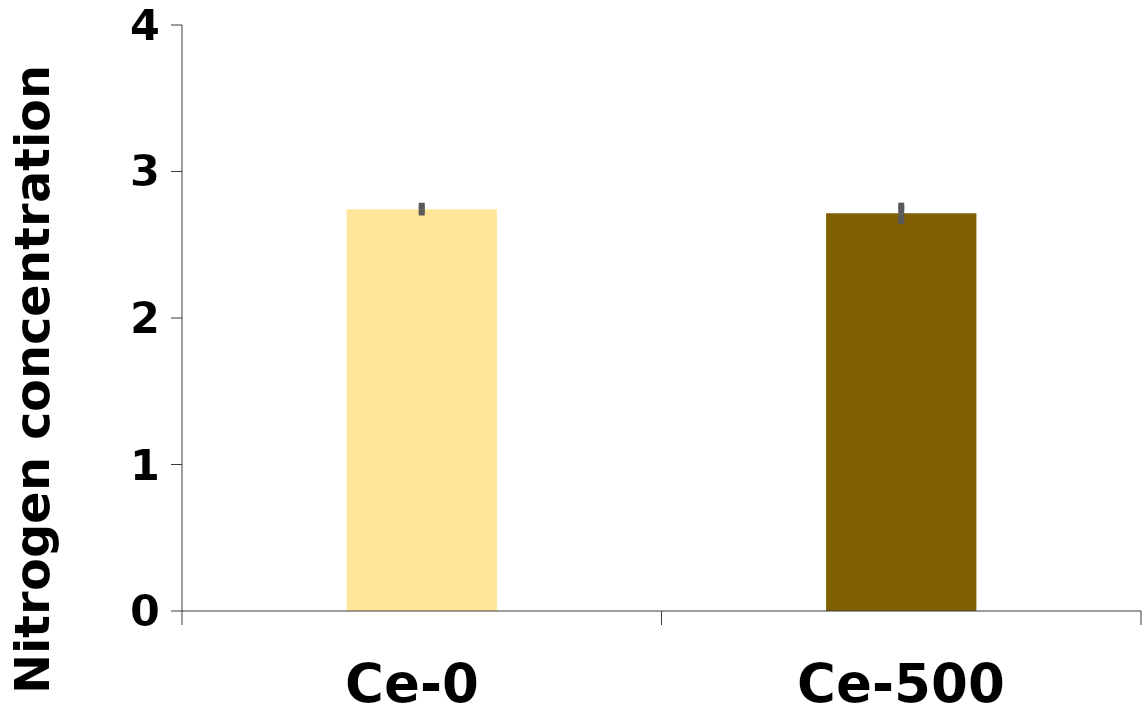
| Category | %N |
|---|---|
| Ce-0 | 2.743 |
| Ce-500 | 2.714 |